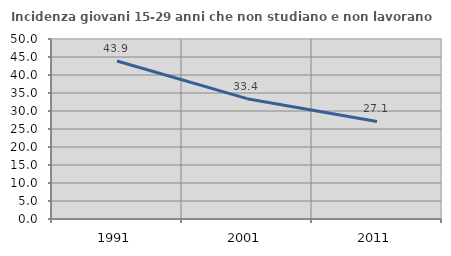
| Category | Incidenza giovani 15-29 anni che non studiano e non lavorano  |
|---|---|
| 1991.0 | 43.873 |
| 2001.0 | 33.423 |
| 2011.0 | 27.099 |